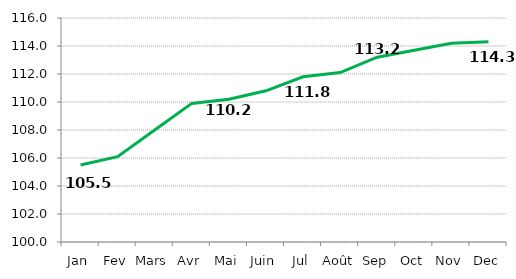
| Category |   INDICE  GENERAL     |
|---|---|
| Jan | 105.5 |
| Fev | 106.1 |
| Mars | 108 |
| Avr | 109.9 |
| Mai | 110.2 |
| Juin | 110.8 |
| Jul | 111.8 |
| Août | 112.1 |
| Sep | 113.2 |
| Oct | 113.7 |
| Nov | 114.2 |
| Dec | 114.3 |